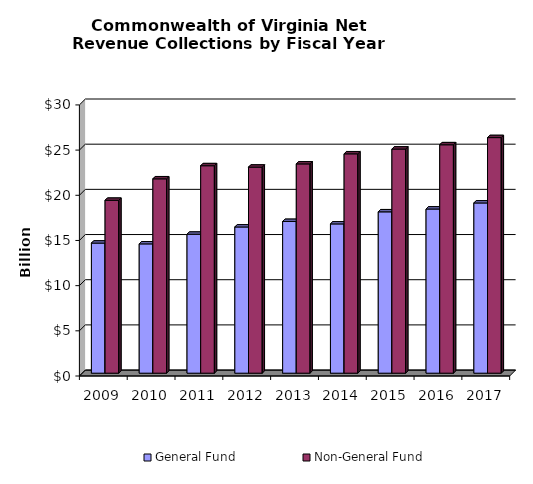
| Category | General Fund | Non-General Fund  |
|---|---|---|
| 2009.0 | 14.398 | 19.134 |
| 2010.0 | 14.31 | 21.508 |
| 2011.0 | 15.379 | 22.96 |
| 2012.0 | 16.182 | 22.803 |
| 2013.0 | 16.792 | 23.162 |
| 2014.0 | 16.52 | 24.275 |
| 2015.0 | 17.857 | 24.805 |
| 2016.0 | 18.17 | 25.28 |
| 2017.0 | 18.84 | 26.074 |